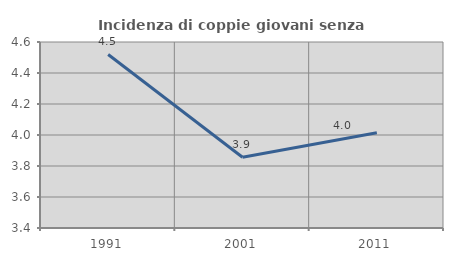
| Category | Incidenza di coppie giovani senza figli |
|---|---|
| 1991.0 | 4.52 |
| 2001.0 | 3.856 |
| 2011.0 | 4.015 |